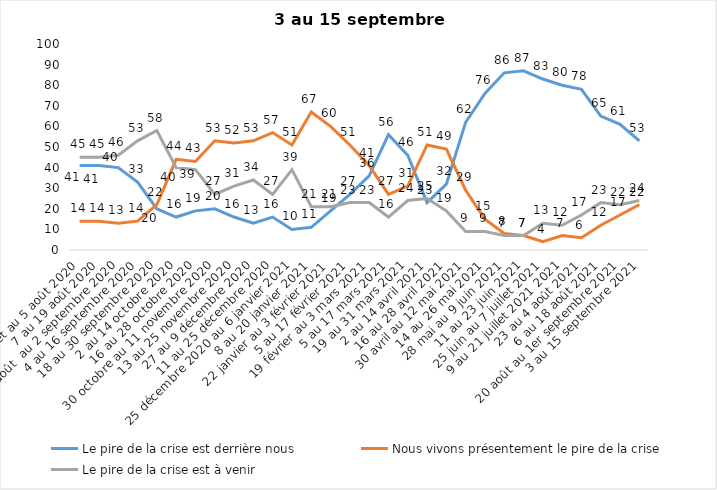
| Category | Le pire de la crise est derrière nous | Nous vivons présentement le pire de la crise | Le pire de la crise est à venir |
|---|---|---|---|
| 24 juillet au 5 août 2020 | 41 | 14 | 45 |
| 7 au 19 août 2020 | 41 | 14 | 45 |
| 21 août  au 2 septembre 2020 | 40 | 13 | 46 |
| 4 au 16 septembre 2020 | 33 | 14 | 53 |
| 18 au 30 septembre 2020 | 20 | 22 | 58 |
| 2 au 14 octobre 2020 | 16 | 44 | 40 |
| 16 au 28 octobre 2020 | 19 | 43 | 39 |
| 30 octobre au 11 novembre 2020 | 20 | 53 | 27 |
| 13 au 25 novembre 2020 | 16 | 52 | 31 |
| 27 au 9 décembre 2020 | 13 | 53 | 34 |
| 11 au 25 décembre 2020 | 16 | 57 | 27 |
| 25 décembre 2020 au 6 janvier 2021 | 10 | 51 | 39 |
| 8 au 20 janvier 2021 | 11 | 67 | 21 |
| 22 janvier au 3 février 2021 | 19 | 60 | 21 |
| 5 au 17 février 2021 | 27 | 51 | 23 |
| 19 février au 3 mars 2021 | 36 | 41 | 23 |
| 5 au 17 mars 2021 | 56 | 27 | 16 |
| 19 au 31 mars 2021 | 46 | 31 | 24 |
| 2 au 14 avril 2021 | 23 | 51 | 25 |
| 16 au 28 avril 2021 | 32 | 49 | 19 |
| 30 avril au 12 mai 2021 | 62 | 29 | 9 |
| 14 au 26 mai 2021 | 76 | 15 | 9 |
| 28 mai au 9 juin 2021 | 86 | 8 | 7 |
| 11 au 23 juin 2021 | 87 | 7 | 7 |
| 25 juin au 7 juillet 2021 | 83 | 4 | 13 |
| 9 au 21 juillet 2021 2021 | 80 | 7 | 12 |
| 23 au 4 août 2021 | 78 | 6 | 17 |
| 6 au 18 août 2021 | 65 | 12 | 23 |
| 20 août au 1er septembre 2021 | 61 | 17 | 22 |
| 3 au 15 septembre 2021 | 53 | 22 | 24 |